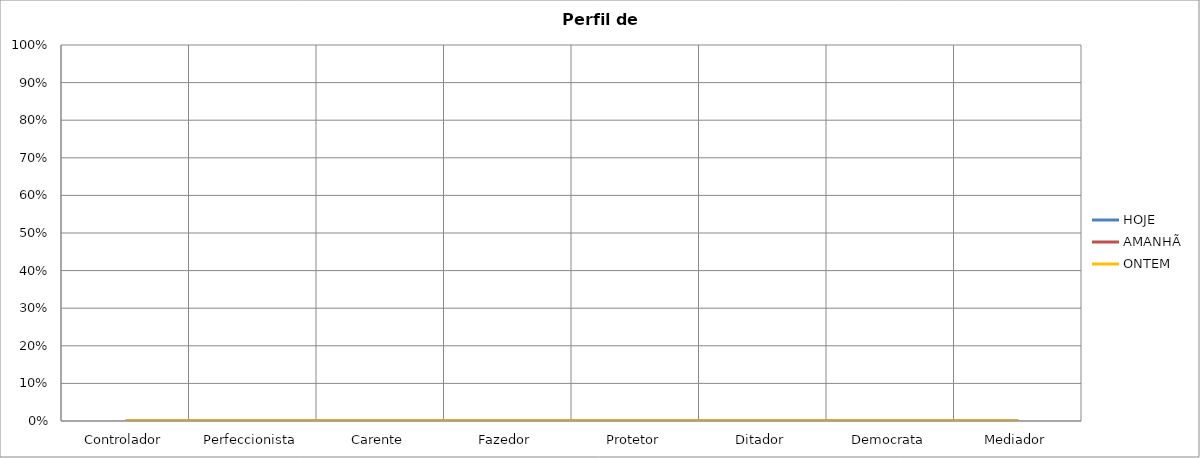
| Category | HOJE | AMANHÃ | ONTEM |
|---|---|---|---|
| Controlador | 0 | 0 | 0 |
| Perfeccionista | 0 | 0 | 0 |
| Carente | 0 | 0 | 0 |
| Fazedor | 0 | 0 | 0 |
| Protetor | 0 | 0 | 0 |
| Ditador | 0 | 0 | 0 |
| Democrata | 0 | 0 | 0 |
| Mediador | 0 | 0 | 0 |